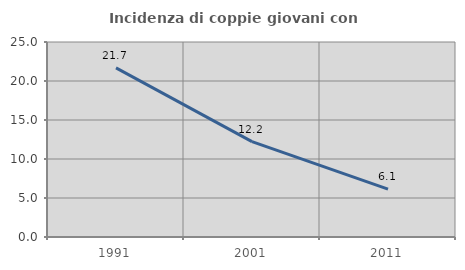
| Category | Incidenza di coppie giovani con figli |
|---|---|
| 1991.0 | 21.69 |
| 2001.0 | 12.222 |
| 2011.0 | 6.14 |